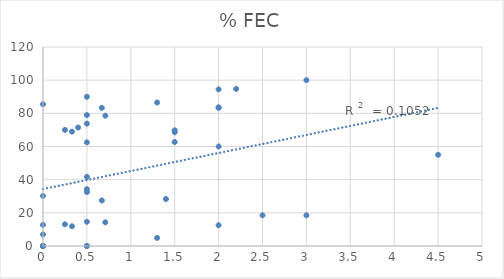
| Category | % FEC |
|---|---|
| 2.0 | 83.636 |
| 2.0 | 94.444 |
| 3.0 | 100 |
| 1.5 | 62.712 |
| 1.5 | 69.767 |
| 1.5 | 68.571 |
| 2.0 | 60 |
| 2.0 | 83.333 |
| 1.3 | 4.878 |
| 2.5 | 18.519 |
| 3.0 | 18.519 |
| 1.3 | 86.538 |
| 4.5 | 55 |
| 2.2 | 94.737 |
| 1.4 | 28.333 |
| 2.0 | 12.5 |
| 0.0 | 0 |
| 0.0 | 30.233 |
| 0.0 | 0 |
| 0.0 | 0 |
| 0.0 | 0 |
| 0.0 | 85.484 |
| 0.0 | 12.727 |
| 0.0 | 6.977 |
| 0.5 | 0 |
| 0.5 | 62.5 |
| 0.5 | 73.81 |
| 0.5 | 32.558 |
| 0.5 | 0 |
| 0.5 | 14.583 |
| 0.5 | 78.947 |
| 0.5 | 34.286 |
| 0.5 | 41.667 |
| 0.5 | 90 |
| 0.33 | 68.966 |
| 0.33 | 11.905 |
| 0.25 | 13.115 |
| 0.25 | 70 |
| 0.67 | 27.419 |
| 0.4 | 71.429 |
| 0.71 | 78.571 |
| 0.71 | 14.286 |
| 0.67 | 83.333 |